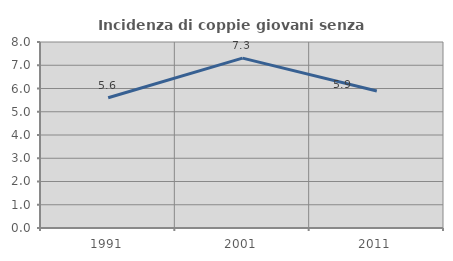
| Category | Incidenza di coppie giovani senza figli |
|---|---|
| 1991.0 | 5.605 |
| 2001.0 | 7.306 |
| 2011.0 | 5.89 |